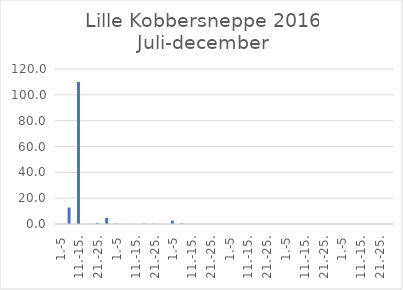
| Category | Series 0 |
|---|---|
| 1.-5 | 0 |
| 6.-10. | 12.717 |
| 11.-15. | 110 |
| 16.-20. | 0 |
| 21.-25. | 0.774 |
| 26.-31. | 4.712 |
| 1.-5 | 0.364 |
| 6.-10. | 0.074 |
| 11.-15. | 0 |
| 16.-20. | 0.45 |
| 21.-25. | 0.27 |
| 26.-31. | 0.074 |
| 1.-5 | 2.582 |
| 6.-10. | 0.523 |
| 11.-15. | 0 |
| 16.-20. | 0 |
| 21.-25. | 0 |
| 26.-30. | 0.022 |
| 1.-5 | 0 |
| 6.-10. | 0 |
| 11.-15. | 0 |
| 16.-20. | 0 |
| 21.-25. | 0 |
| 26.-31. | 0 |
| 1.-5 | 0 |
| 6.-10. | 0 |
| 11.-15. | 0 |
| 16.-20. | 0 |
| 21.-25. | 0 |
| 26.-30. | 0 |
| 1.-5 | 0 |
| 6.-10. | 0 |
| 11.-15. | 0 |
| 16.-20. | 0 |
| 21.-25. | 0 |
| 26.-31. | 0 |